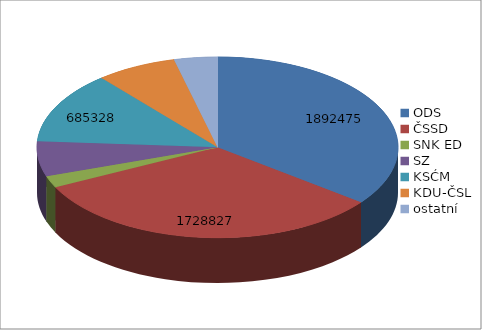
| Category | Series 0 |
|---|---|
| ODS | 1892475 |
| ČSSD | 1728827 |
| SNK ED | 111724 |
| SZ | 336487 |
| KSĆM | 685328 |
| KDU-ČSL | 386706 |
| ostatní | 207429 |